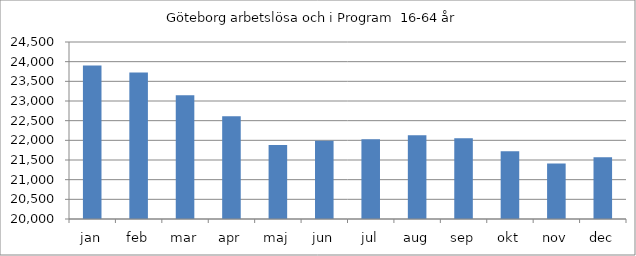
| Category | Göteborg |
|---|---|
| jan | 23900 |
| feb | 23723 |
| mar | 23146 |
| apr | 22613 |
| maj | 21881 |
| jun | 21990 |
| jul | 22027 |
| aug | 22129 |
| sep | 22056 |
| okt | 21725 |
| nov | 21409 |
| dec | 21572 |